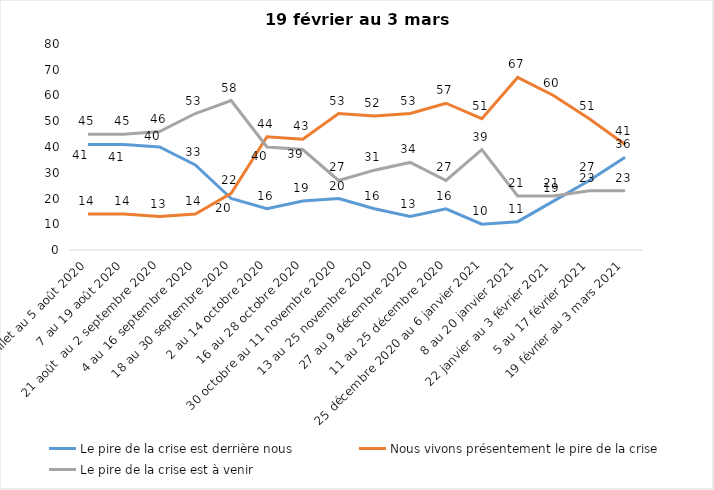
| Category | Le pire de la crise est derrière nous | Nous vivons présentement le pire de la crise | Le pire de la crise est à venir |
|---|---|---|---|
| 24 juillet au 5 août 2020 | 41 | 14 | 45 |
| 7 au 19 août 2020 | 41 | 14 | 45 |
| 21 août  au 2 septembre 2020 | 40 | 13 | 46 |
| 4 au 16 septembre 2020 | 33 | 14 | 53 |
| 18 au 30 septembre 2020 | 20 | 22 | 58 |
| 2 au 14 octobre 2020 | 16 | 44 | 40 |
| 16 au 28 octobre 2020 | 19 | 43 | 39 |
| 30 octobre au 11 novembre 2020 | 20 | 53 | 27 |
| 13 au 25 novembre 2020 | 16 | 52 | 31 |
| 27 au 9 décembre 2020 | 13 | 53 | 34 |
| 11 au 25 décembre 2020 | 16 | 57 | 27 |
| 25 décembre 2020 au 6 janvier 2021 | 10 | 51 | 39 |
| 8 au 20 janvier 2021 | 11 | 67 | 21 |
| 22 janvier au 3 février 2021 | 19 | 60 | 21 |
| 5 au 17 février 2021 | 27 | 51 | 23 |
| 19 février au 3 mars 2021 | 36 | 41 | 23 |